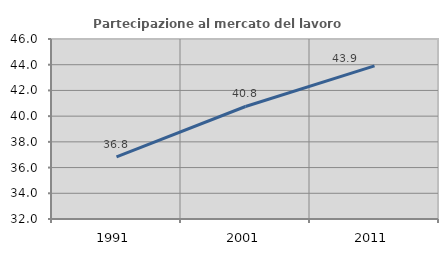
| Category | Partecipazione al mercato del lavoro  femminile |
|---|---|
| 1991.0 | 36.834 |
| 2001.0 | 40.751 |
| 2011.0 | 43.915 |